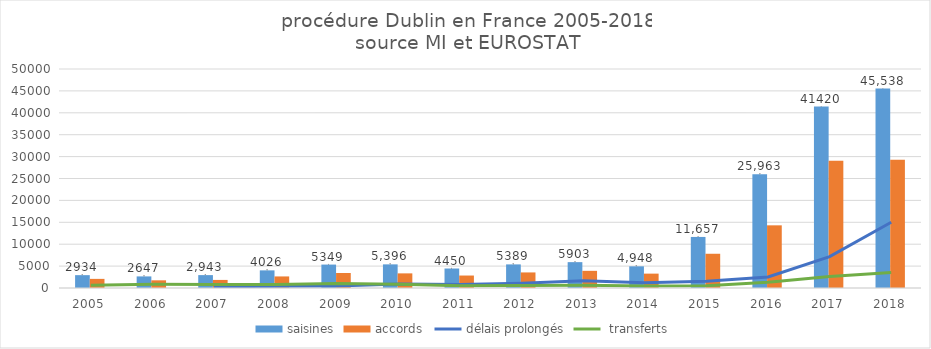
| Category | saisines | accords  | refus  |
|---|---|---|---|
| 2005.0 | 2934 | 2083 |  |
| 2006.0 | 2647 | 1754 |  |
| 2007.0 | 2943 | 1843 |  |
| 2008.0 | 4026 | 2641 |  |
| 2009.0 | 5349 | 3430 |  |
| 2010.0 | 5396 | 3340 |  |
| 2011.0 | 4450 | 2847 |  |
| 2012.0 | 5389 | 3555 |  |
| 2013.0 | 5903 | 3919 |  |
| 2014.0 | 4948 | 3281 |  |
| 2015.0 | 11657 | 7817 |  |
| 2016.0 | 25963 | 14308 |  |
| 2017.0 | 41420 | 29046 |  |
| 2018.0 | 45538 | 29259 |  |